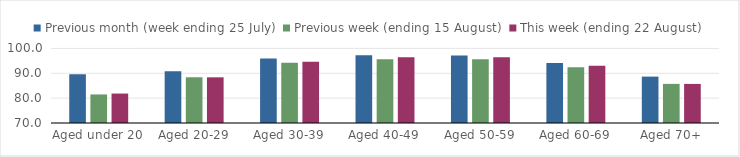
| Category | Previous month (week ending 25 July) | Previous week (ending 15 August) | This week (ending 22 August) |
|---|---|---|---|
| Aged under 20 | 89.612 | 81.49 | 81.846 |
| Aged 20-29 | 90.816 | 88.399 | 88.375 |
| Aged 30-39 | 95.948 | 94.271 | 94.656 |
| Aged 40-49 | 97.283 | 95.651 | 96.435 |
| Aged 50-59 | 97.111 | 95.602 | 96.495 |
| Aged 60-69 | 94.176 | 92.445 | 93.055 |
| Aged 70+ | 88.658 | 85.743 | 85.727 |